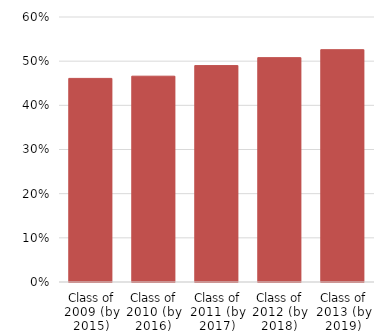
| Category | Series 0 |
|---|---|
| Class of 2009 (by 2015) | 0.461 |
| Class of 2010 (by 2016) | 0.466 |
| Class of 2011 (by 2017) | 0.49 |
| Class of 2012 (by 2018) | 0.508 |
| Class of 2013 (by 2019) | 0.526 |